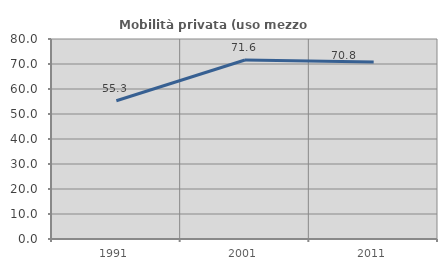
| Category | Mobilità privata (uso mezzo privato) |
|---|---|
| 1991.0 | 55.316 |
| 2001.0 | 71.62 |
| 2011.0 | 70.776 |